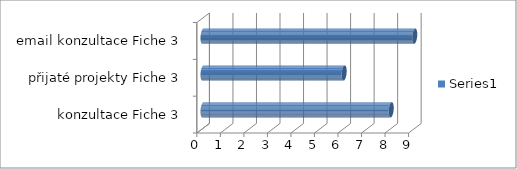
| Category | Series 0 |
|---|---|
|  konzultace Fiche 3 | 8 |
| přijaté projekty Fiche 3 | 6 |
| email konzultace Fiche 3 | 9 |